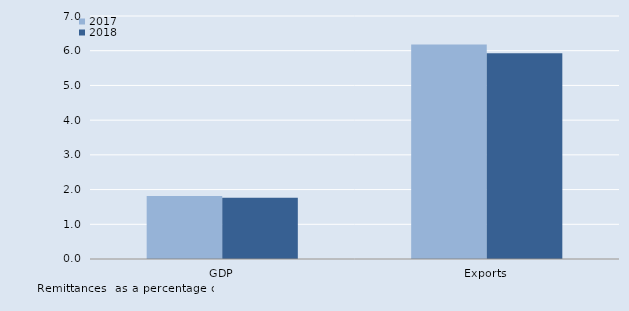
| Category | 2017 | 2018 |
|---|---|---|
| GDP | 1.814 | 1.768 |
| Exports | 6.182 | 5.93 |